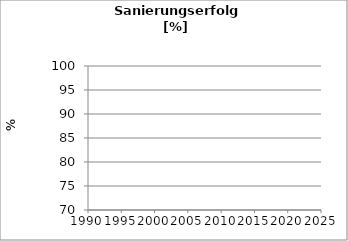
| Category | Series 1 |
|---|---|
| 1992.0 | 0 |
| 1993.0 | 0 |
| 1994.0 | 0 |
| 1995.0 | 0 |
| 1996.0 | 0 |
| 1997.0 | 0 |
| 1998.0 | 0 |
| 1999.0 | 0 |
| 2000.0 | 0 |
| 2001.0 | 0 |
| 2002.0 | 0 |
| 2003.0 | 0 |
| 2004.0 | 0 |
| 2005.0 | 0 |
| 2006.0 | 0 |
| 2007.0 | 0 |
| 2008.0 | 0 |
| 2009.0 | 0 |
| 2010.0 | 0 |
| 2011.0 | 0 |
| 2012.0 | 0 |
| 2013.0 | 0 |
| 2014.0 | 0 |
| 2015.0 | 0 |
| 2016.0 | 0 |
| 2017.0 | 0 |
| 2018.0 | 0 |
| 2019.0 | 0 |
| 2020.0 | 0 |
| 2021.0 | 0 |
| 2022.0 | 0 |
| 2023.0 | 0 |
| 2024.0 | 0 |